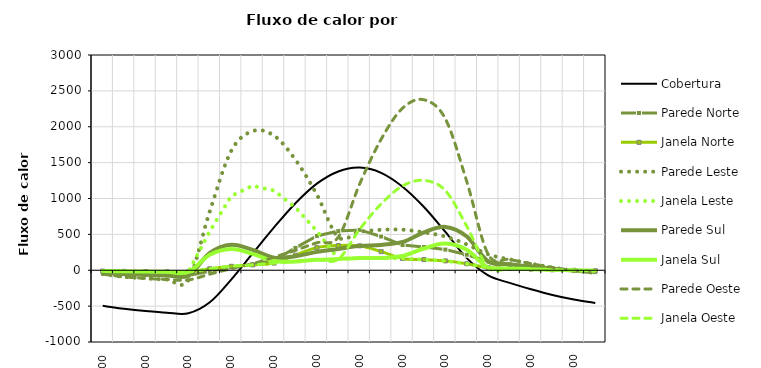
| Category | Cobertura | Parede Norte | Janela Norte | Parede Leste | Janela Leste | Parede Sul | Janela Sul | Parede Oeste | Janela Oeste |
|---|---|---|---|---|---|---|---|---|---|
| 0.041666666666666664 | -496 | -24.96 | -10.944 | -53.76 | -10.944 | -24.96 | -10.944 | -53.76 | -10.944 |
| 0.08333333333333333 | -536 | -50.864 | -15.504 | -91.664 | -15.504 | -50.864 | -15.504 | -91.664 | -15.504 |
| 0.125 | -568 | -62.832 | -19.152 | -113.232 | -19.152 | -62.832 | -19.152 | -113.232 | -19.152 |
| 0.166666666666667 | -592 | -71.808 | -21.888 | -129.408 | -21.888 | -71.808 | -21.888 | -129.408 | -21.888 |
| 0.208333333333334 | -600 | -74.8 | -22.8 | -134.8 | -22.8 | -74.8 | -22.8 | -134.8 | -22.8 |
| 0.25 | -447.2 | -14.316 | 20.524 | 821.184 | 543.424 | 240.744 | 214.744 | -54.516 | 20.524 |
| 0.291666666666667 | -130 | 39.884 | 54.964 | 1662.684 | 1034.364 | 355.984 | 295.664 | 22.484 | 54.964 |
| 0.333333333333334 | 233.6 | 82.072 | 74.792 | 1939.172 | 1178.692 | 284.812 | 229.172 | 90.472 | 74.792 |
| 0.375 | 596.8 | 138.408 | 99.928 | 1875.828 | 1110.868 | 175.468 | 128.148 | 182.808 | 99.928 |
| 0.416666666666667 | 934 | 311.908 | 211.548 | 1539.708 | 875.548 | 194.188 | 121.908 | 277.588 | 121.908 |
| 0.458333333333334 | 1206.8 | 478.312 | 315.032 | 1053.132 | 545.772 | 255.952 | 145.712 | 383.152 | 145.712 |
| 0.5 | 1376.8 | 545.804 | 344.564 | 461.084 | 155.324 | 297.284 | 155.324 | 461.084 | 155.324 |
| 0.541666666666667 | 1430.8 | 562.088 | 340.568 | 534.128 | 171.248 | 339.728 | 171.248 | 1204.108 | 571.308 |
| 0.583333333333334 | 1358 | 470.484 | 259.884 | 563.364 | 170.244 | 352.764 | 170.244 | 1825.484 | 923.884 |
| 0.625 | 1164.8 | 350.84 | 164.68 | 565.64 | 164.68 | 394.44 | 197.88 | 2258.66 | 1175.62 |
| 0.666666666666667 | 881.6 | 324.424 | 148.664 | 527.224 | 148.664 | 527.164 | 303.044 | 2375.924 | 1252.564 |
| 0.708333333333334 | 534 | 288.22 | 130.66 | 470.02 | 130.66 | 604.32 | 371.36 | 2110.22 | 1110.06 |
| 0.75 | 168.8 | 216.068 | 90.748 | 360.668 | 90.748 | 471.128 | 284.968 | 1236.368 | 613.648 |
| 0.791666666666667 | -72 | 122.672 | 37.392 | 221.072 | 37.392 | 122.672 | 37.392 | 221.072 | 37.392 |
| 0.833333333333334 | -176 | 83.776 | 25.536 | 150.976 | 25.536 | 83.776 | 25.536 | 150.976 | 25.536 |
| 0.875 | -264 | 50.864 | 15.504 | 91.664 | 15.504 | 50.864 | 15.504 | 91.664 | 15.504 |
| 0.916666666666667 | -344 | 20.944 | 6.384 | 37.744 | 6.384 | 20.944 | 6.384 | 37.744 | 6.384 |
| 0.958333333333334 | -408 | -2.992 | -0.912 | -5.392 | -0.912 | -2.992 | -0.912 | -5.392 | -0.912 |
| 00:00 | -456 | -20.944 | -6.384 | -37.744 | -6.384 | -20.944 | -6.384 | -37.744 | -6.384 |